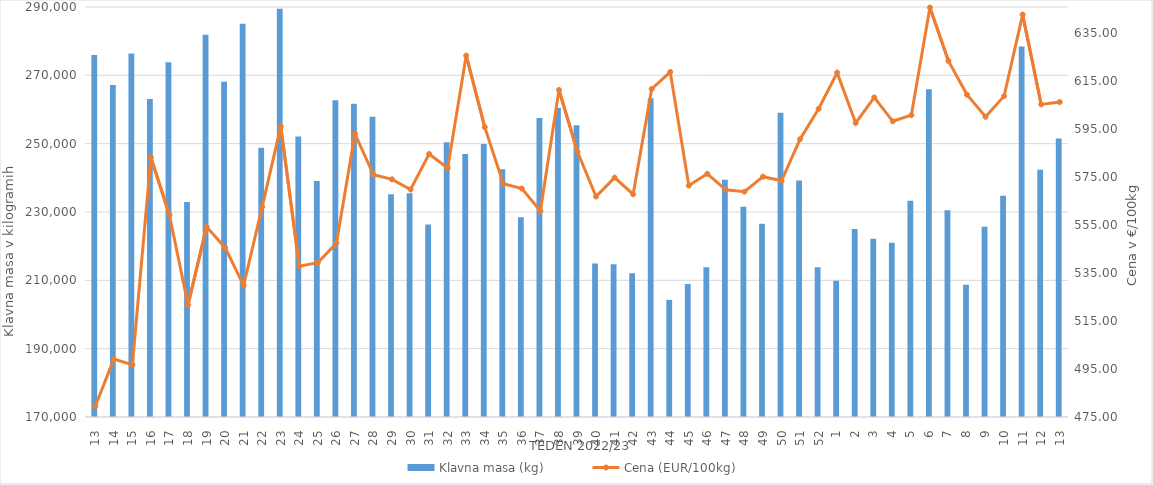
| Category | Klavna masa (kg) |
|---|---|
| 13.0 | 275950 |
| 14.0 | 267148 |
| 15.0 | 276417 |
| 16.0 | 263098 |
| 17.0 | 273824 |
| 18.0 | 232926 |
| 19.0 | 281859 |
| 20.0 | 268153 |
| 21.0 | 285073 |
| 22.0 | 248783 |
| 23.0 | 289478 |
| 24.0 | 252069 |
| 25.0 | 239099 |
| 26.0 | 262689 |
| 27.0 | 261656 |
| 28.0 | 257905 |
| 29.0 | 235185 |
| 30.0 | 235475 |
| 31.0 | 226322 |
| 32.0 | 250418 |
| 33.0 | 246996 |
| 34.0 | 249873 |
| 35.0 | 242516 |
| 36.0 | 228469 |
| 37.0 | 257511 |
| 38.0 | 260481 |
| 39.0 | 255370 |
| 40.0 | 214936 |
| 41.0 | 214672 |
| 42.0 | 212066 |
| 43.0 | 263287 |
| 44.0 | 204280 |
| 45.0 | 208920 |
| 46.0 | 213836 |
| 47.0 | 239417 |
| 48.0 | 231565 |
| 49.0 | 226575 |
| 50.0 | 259073 |
| 51.0 | 239211 |
| 52.0 | 213841 |
| 1.0 | 209877 |
| 2.0 | 225045 |
| 3.0 | 222198 |
| 4.0 | 221002 |
| 5.0 | 233306 |
| 6.0 | 265944 |
| 7.0 | 230531 |
| 8.0 | 208699 |
| 9.0 | 225712 |
| 10.0 | 234762 |
| 11.0 | 278467 |
| 12.0 | 242369 |
| 13.0 | 251507 |